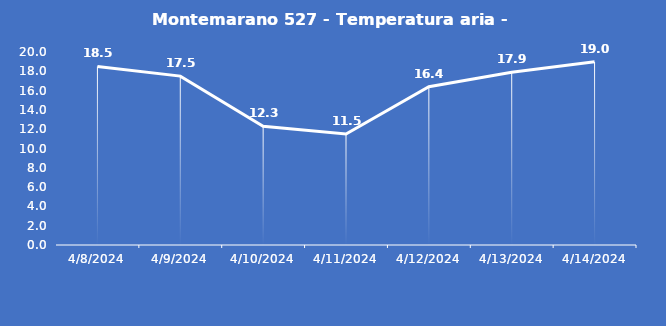
| Category | Montemarano 527 - Temperatura aria - Grezzo (°C) |
|---|---|
| 4/8/24 | 18.5 |
| 4/9/24 | 17.5 |
| 4/10/24 | 12.3 |
| 4/11/24 | 11.5 |
| 4/12/24 | 16.4 |
| 4/13/24 | 17.9 |
| 4/14/24 | 19 |